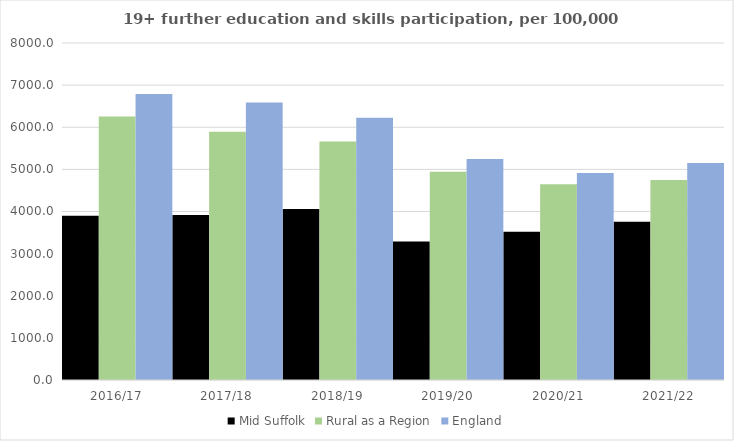
| Category | Mid Suffolk | Rural as a Region | England |
|---|---|---|---|
| 2016/17 | 3897 | 6253.401 | 6788 |
| 2017/18 | 3914 | 5892.029 | 6588 |
| 2018/19 | 4062 | 5661.873 | 6227 |
| 2019/20 | 3287 | 4943.801 | 5244 |
| 2020/21 | 3522 | 4646.727 | 4913 |
| 2021/22 | 3754 | 4747.049 | 5151 |